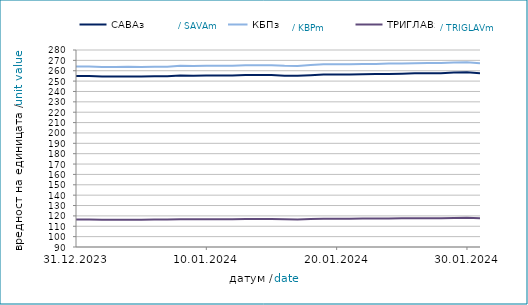
| Category | САВАз | КБПз | ТРИГЛАВз |
|---|---|---|---|
| 2023-12-31 | 254.97 | 264.141 | 116.464 |
| 2024-01-01 | 254.985 | 264.157 | 116.472 |
| 2024-01-02 | 254.556 | 263.552 | 116.268 |
| 2024-01-03 | 254.376 | 263.558 | 116.269 |
| 2024-01-04 | 254.557 | 263.82 | 116.359 |
| 2024-01-05 | 254.363 | 263.68 | 116.309 |
| 2024-01-06 | 254.567 | 263.913 | 116.411 |
| 2024-01-07 | 254.583 | 263.929 | 116.419 |
| 2024-01-08 | 255.415 | 264.917 | 116.824 |
| 2024-01-09 | 255.283 | 264.599 | 116.69 |
| 2024-01-10 | 255.466 | 264.908 | 116.8 |
| 2024-01-11 | 255.411 | 264.874 | 116.764 |
| 2024-01-12 | 255.47 | 264.889 | 116.727 |
| 2024-01-13 | 255.862 | 265.318 | 116.894 |
| 2024-01-14 | 255.878 | 265.333 | 116.902 |
| 2024-01-15 | 255.825 | 265.326 | 116.911 |
| 2024-01-16 | 255.168 | 264.698 | 116.652 |
| 2024-01-17 | 255.11 | 264.642 | 116.63 |
| 2024-01-18 | 255.757 | 265.432 | 116.936 |
| 2024-01-19 | 256.403 | 266.255 | 117.264 |
| 2024-01-20 | 256.419 | 266.271 | 117.272 |
| 2024-01-21 | 256.435 | 266.287 | 117.28 |
| 2024-01-22 | 256.704 | 266.474 | 117.398 |
| 2024-01-23 | 256.803 | 266.501 | 117.419 |
| 2024-01-24 | 256.917 | 266.921 | 117.558 |
| 2024-01-25 | 257.07 | 267.015 | 117.634 |
| 2024-01-26 | 257.472 | 267.254 | 117.728 |
| 2024-01-27 | 257.626 | 267.424 | 117.803 |
| 2024-01-28 | 257.642 | 267.44 | 117.812 |
| 2024-01-29 | 258.353 | 268 | 118.055 |
| 2024-01-30 | 258.609 | 268.289 | 118.188 |
| 2024-01-31 | 257.693 | 267.25 | 117.704 |